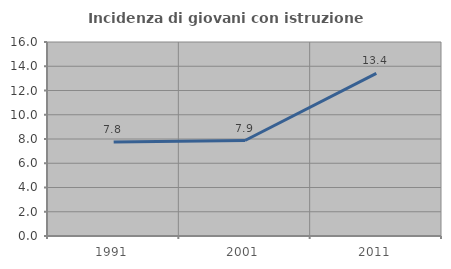
| Category | Incidenza di giovani con istruzione universitaria |
|---|---|
| 1991.0 | 7.759 |
| 2001.0 | 7.874 |
| 2011.0 | 13.415 |